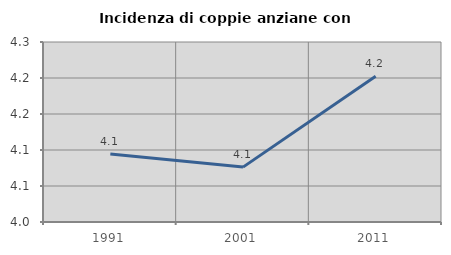
| Category | Incidenza di coppie anziane con figli |
|---|---|
| 1991.0 | 4.094 |
| 2001.0 | 4.076 |
| 2011.0 | 4.203 |